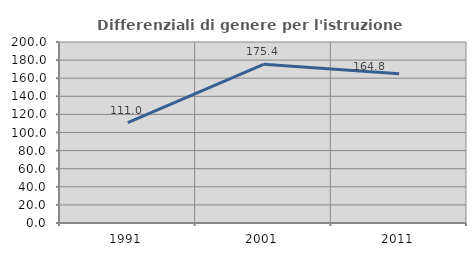
| Category | Differenziali di genere per l'istruzione superiore |
|---|---|
| 1991.0 | 111 |
| 2001.0 | 175.385 |
| 2011.0 | 164.796 |